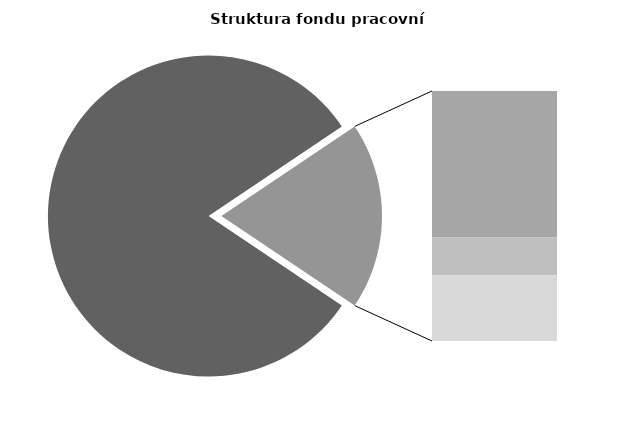
| Category | Series 0 |
|---|---|
| Průměrná měsíční odpracovaná doba bez přesčasu | 139.377 |
| Dovolená | 18.968 |
| Nemoc | 4.876 |
| Jiné | 8.516 |